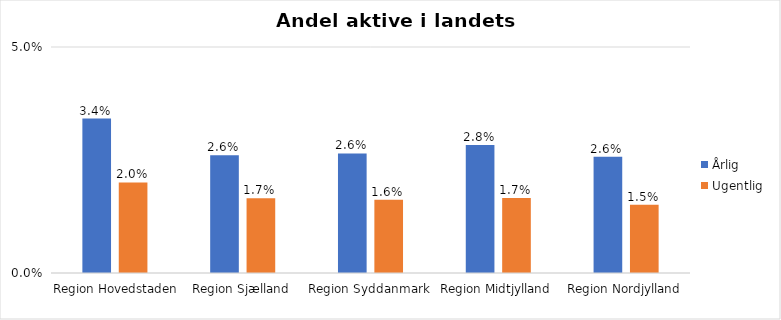
| Category | Årlig | Ugentlig |
|---|---|---|
| Region Hovedstaden | 0.034 | 0.02 |
| Region Sjælland | 0.026 | 0.017 |
| Region Syddanmark | 0.026 | 0.016 |
| Region Midtjylland | 0.028 | 0.017 |
| Region Nordjylland | 0.026 | 0.015 |